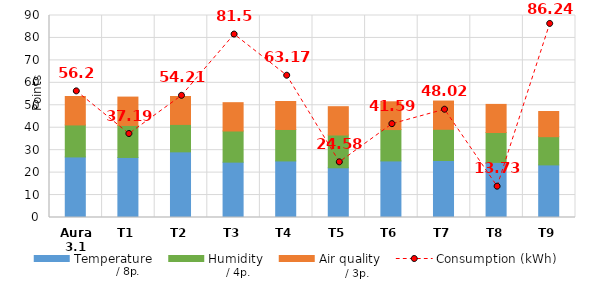
| Category | Temperature | Humidity | Air quality |
|---|---|---|---|
| Aura 3.1 | 26.986 | 14.255 | 12.68 |
| T1 | 26.745 | 14.279 | 12.626 |
| T2 | 29.25 | 12.224 | 12.443 |
| T3 | 24.665 | 13.876 | 12.616 |
| T4 | 25.202 | 14.023 | 12.46 |
| T5 | 22.148 | 14.614 | 12.61 |
| T6 | 25.21 | 13.971 | 12.371 |
| T7 | 25.402 | 13.904 | 12.579 |
| T8 | 24.53 | 13.328 | 12.535 |
| T9 | 23.441 | 12.572 | 11.203 |